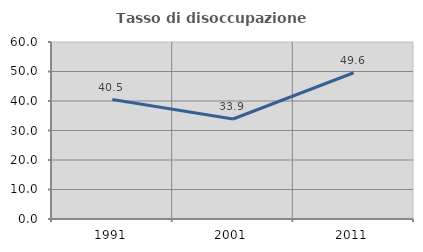
| Category | Tasso di disoccupazione giovanile  |
|---|---|
| 1991.0 | 40.476 |
| 2001.0 | 33.898 |
| 2011.0 | 49.573 |